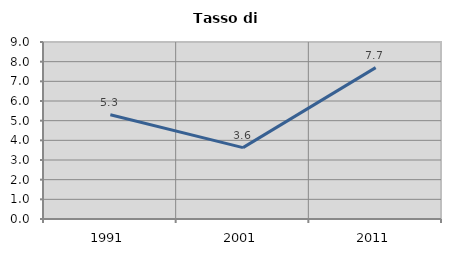
| Category | Tasso di disoccupazione   |
|---|---|
| 1991.0 | 5.299 |
| 2001.0 | 3.628 |
| 2011.0 | 7.698 |